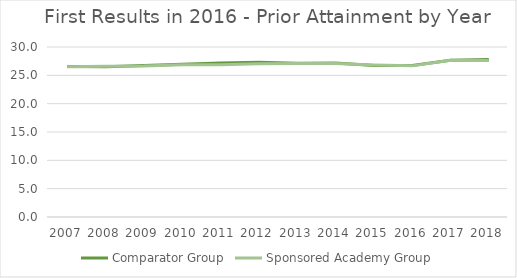
| Category | Comparator Group | Sponsored Academy Group |
|---|---|---|
| 2007.0 | 26.545 | 26.498 |
| 2008.0 | 26.51 | 26.589 |
| 2009.0 | 26.749 | 26.637 |
| 2010.0 | 26.969 | 26.848 |
| 2011.0 | 27.187 | 26.883 |
| 2012.0 | 27.296 | 27.064 |
| 2013.0 | 27.136 | 27.067 |
| 2014.0 | 27.158 | 27.081 |
| 2015.0 | 26.733 | 26.841 |
| 2016.0 | 26.743 | 26.67 |
| 2017.0 | 27.67 | 27.645 |
| 2018.0 | 27.788 | 27.632 |